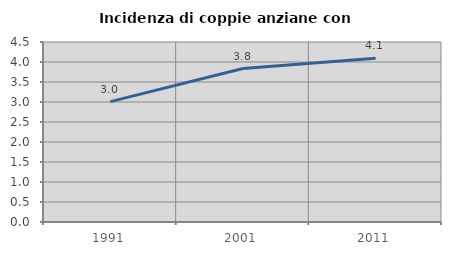
| Category | Incidenza di coppie anziane con figli |
|---|---|
| 1991.0 | 3.009 |
| 2001.0 | 3.837 |
| 2011.0 | 4.096 |